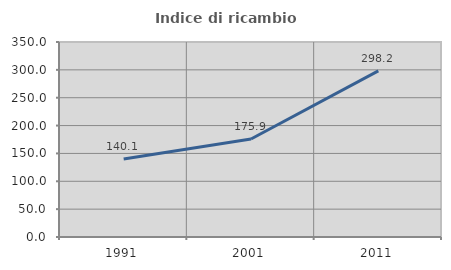
| Category | Indice di ricambio occupazionale  |
|---|---|
| 1991.0 | 140.146 |
| 2001.0 | 175.926 |
| 2011.0 | 298.246 |